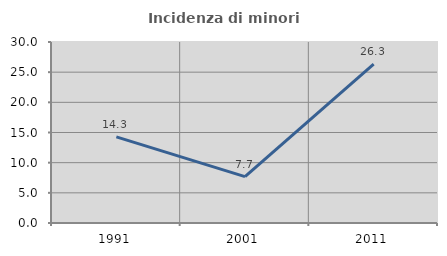
| Category | Incidenza di minori stranieri |
|---|---|
| 1991.0 | 14.286 |
| 2001.0 | 7.692 |
| 2011.0 | 26.316 |